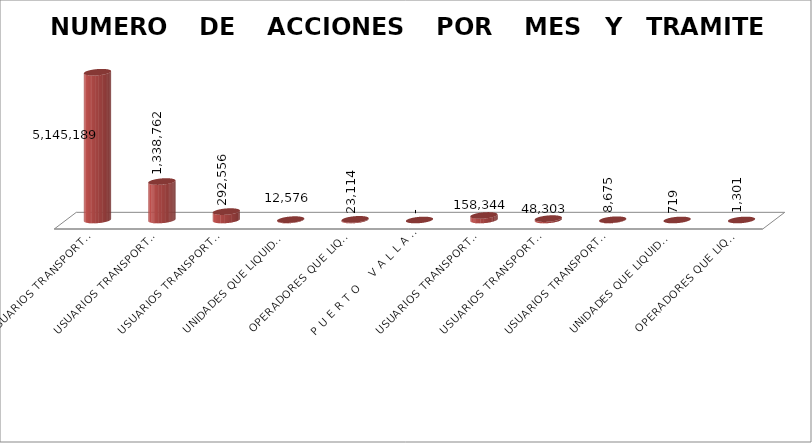
| Category | Series 0 |
|---|---|
| USUARIOS TRANSPORTACION TARIFA NORMAL $7.00 Y $6.00 | 5145189 |
| USUARIOS TRANSPORTACION TRANSVALE $3.50 Y $3.00 | 1338762 |
| USUARIOS TRANSPORTACION MENORES DE EDAD $3.50 Y $3.00 | 292556 |
| UNIDADES QUE LIQUIDAN | 12576 |
| OPERADORES QUE LIQUIDAN | 23114 |
| P U E R T O    V A L L A R T A | 0 |
| USUARIOS TRANSPORTACION TARIFA NORMAL $7.50 | 158344 |
| USUARIOS TRANSPORTACION MENORES DE EDAD $3.75 | 48303 |
| USUARIOS TRANSPORTACION BIENEVALE $3.75 | 8675 |
| UNIDADES QUE LIQUIDAN | 719 |
| OPERADORES QUE LIQUIDAN | 1301 |